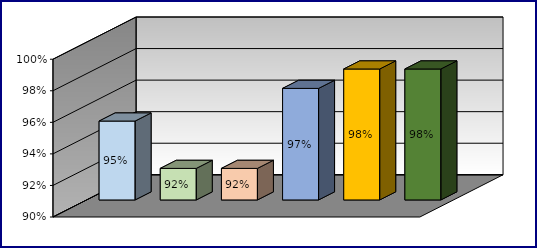
| Category | Series 0 | Series 1 | Series 2 | Series 3 |
|---|---|---|---|---|
| 0 | 0.95 |  |  |  |
| 1 | 0.92 |  |  |  |
| 2 | 0.92 |  |  |  |
| 3 | 0.971 |  |  |  |
| 4 | 0.983 |  |  |  |
| 5 | 0.983 |  |  |  |